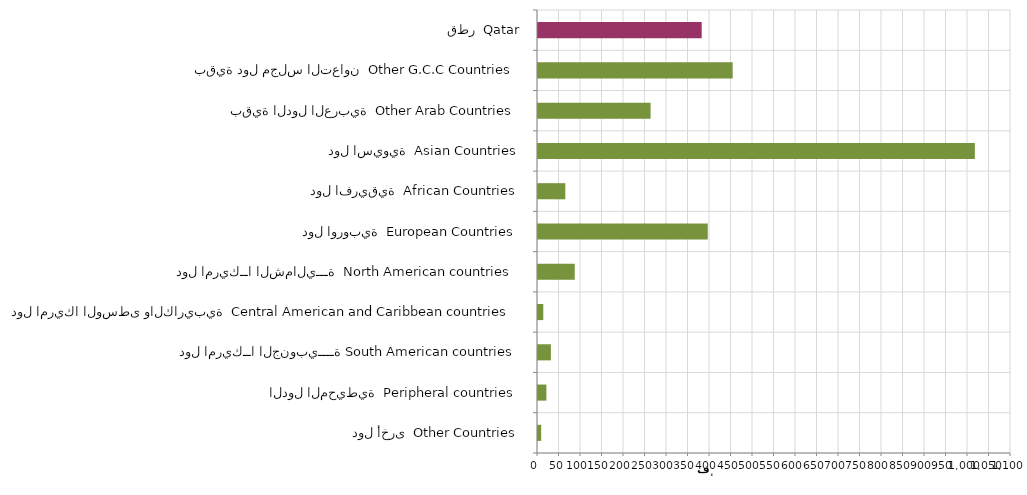
| Category | Series 0 |
|---|---|
| دول أخرى  Other Countries | 7423 |
| الدول المحيطية  Peripheral countries | 19492 |
| دول امريكــا الجنوبيــــة South American countries | 29989 |
| دول امريكا الوسطى والكاريبية  Central American and Caribbean countries | 12315 |
| دول امريكــا الشماليـــة  North American countries  | 85435 |
| دول اوروبية  European Countries | 394798 |
| دول افريقية  African Countries | 63507 |
| دول اسيوية  Asian Countries | 1015972 |
| بقية الدول العربية  Other Arab Countries | 261806 |
| بقية دول مجلس التعاون  Other G.C.C Countries | 452666 |
| قطر  Qatar | 380698 |